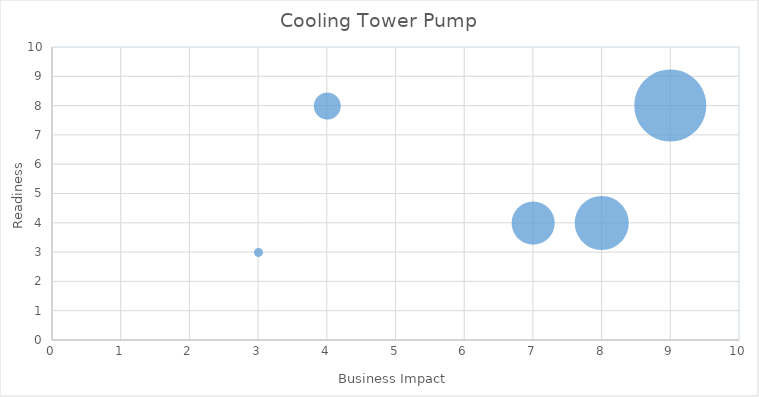
| Category | Series 0 |
|---|---|
| 9.0 | 8 |
| 8.0 | 4 |
| 7.0 | 4 |
| 4.0 | 8 |
| 3.0 | 3 |